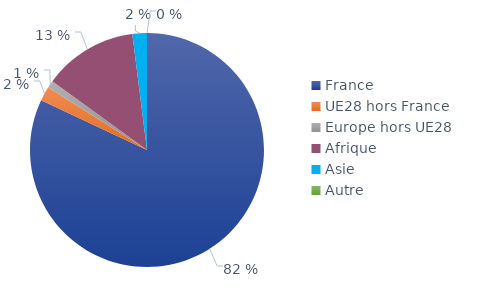
| Category | Series 0 |
|---|---|
| France | 0.82 |
| UE28 hors France | 0.02 |
| Europe hors UE28 | 0.01 |
| Afrique | 0.13 |
| Asie | 0.02 |
| Autre | 0 |